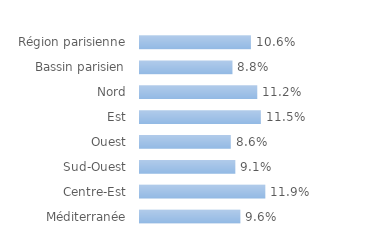
| Category | Series 0 |
|---|---|
| Région parisienne | 0.106 |
| Bassin parisien | 0.088 |
| Nord | 0.112 |
| Est | 0.115 |
| Ouest | 0.086 |
| Sud-Ouest | 0.091 |
| Centre-Est | 0.119 |
| Méditerranée | 0.096 |